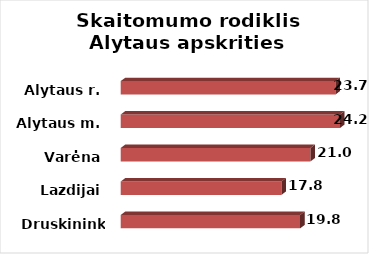
| Category | Series 0 |
|---|---|
| Druskininkai | 19.82 |
| Lazdijai | 17.759 |
| Varėna | 20.964 |
| Alytaus m. | 24.23 |
| Alytaus r. | 23.73 |